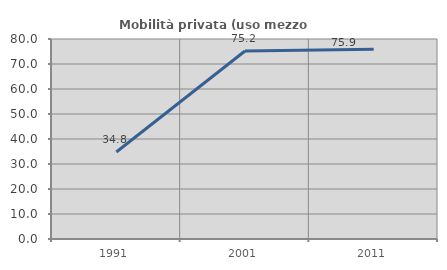
| Category | Mobilità privata (uso mezzo privato) |
|---|---|
| 1991.0 | 34.789 |
| 2001.0 | 75.181 |
| 2011.0 | 75.94 |